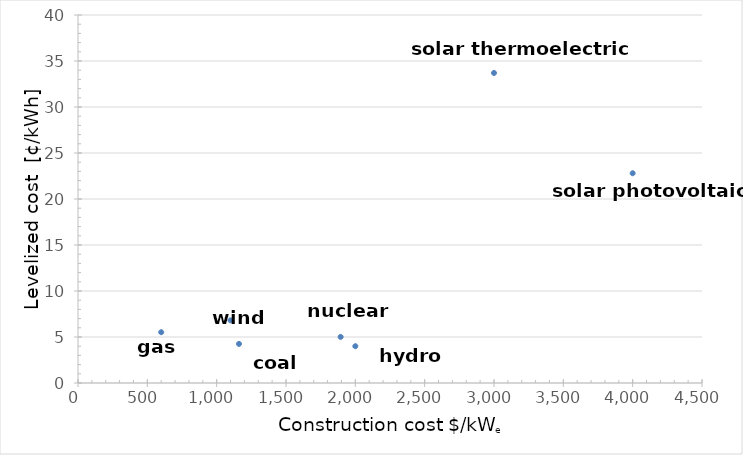
| Category | Levelized Cost |
|---|---|
| 600.0 | 5.52 |
| 1161.0 | 4.25 |
| 1100.0 | 6.81 |
| 2000.0 | 4 |
| 1894.0 | 5.01 |
| 4000.0 | 22.8 |
| 3000.0 | 33.7 |